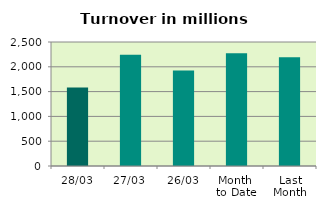
| Category | Series 0 |
|---|---|
| 28/03 | 1584.454 |
| 27/03 | 2242.055 |
| 26/03 | 1927.454 |
| Month 
to Date | 2273.723 |
| Last
Month | 2191.938 |